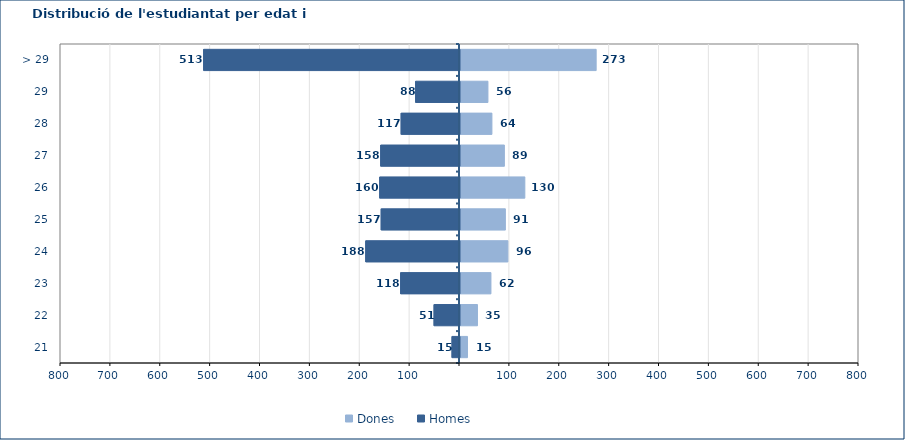
| Category | Dones | Homes |
|---|---|---|
| 21 | 15 | -15 |
| 22 | 35 | -51 |
| 23 | 62 | -118 |
| 24 | 96 | -188 |
| 25 | 91 | -157 |
| 26 | 130 | -160 |
| 27 | 89 | -158 |
| 28 | 64 | -117 |
| 29 | 56 | -88 |
| > 29 | 273 | -513 |